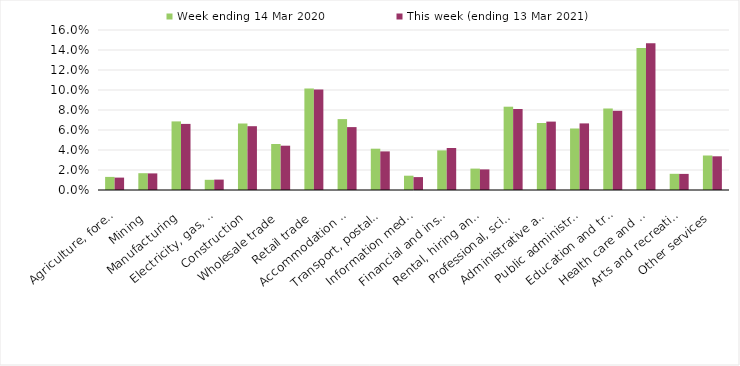
| Category | Week ending 14 Mar 2020 | This week (ending 13 Mar 2021) |
|---|---|---|
| Agriculture, forestry and fishing | 0.013 | 0.012 |
| Mining | 0.017 | 0.017 |
| Manufacturing | 0.069 | 0.066 |
| Electricity, gas, water and waste services | 0.01 | 0.01 |
| Construction | 0.066 | 0.064 |
| Wholesale trade | 0.046 | 0.044 |
| Retail trade | 0.101 | 0.1 |
| Accommodation and food services | 0.071 | 0.063 |
| Transport, postal and warehousing | 0.041 | 0.039 |
| Information media and telecommunications | 0.014 | 0.013 |
| Financial and insurance services | 0.04 | 0.042 |
| Rental, hiring and real estate services | 0.021 | 0.021 |
| Professional, scientific and technical services | 0.083 | 0.081 |
| Administrative and support services | 0.067 | 0.068 |
| Public administration and safety | 0.062 | 0.067 |
| Education and training | 0.082 | 0.079 |
| Health care and social assistance | 0.142 | 0.147 |
| Arts and recreation services | 0.016 | 0.016 |
| Other services | 0.034 | 0.034 |